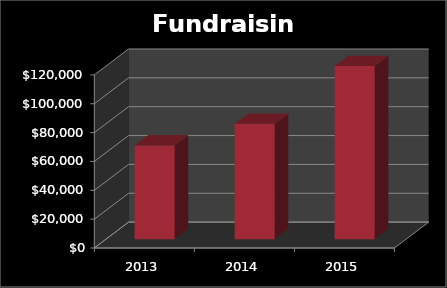
| Category | Total |
|---|---|
| 2013.0 | 65000 |
| 2014.0 | 80000 |
| 2015.0 | 120000 |